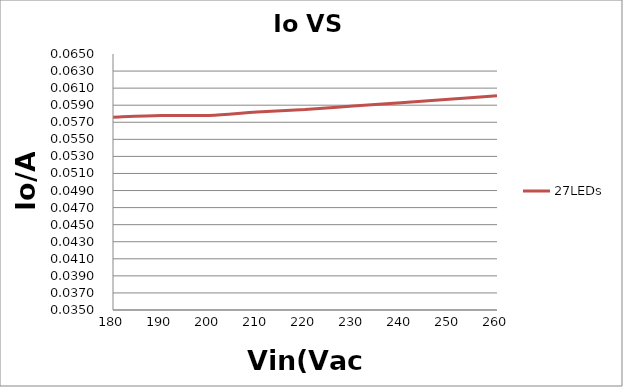
| Category | 27LEDs |
|---|---|
| 180.0 | 0.058 |
| 190.0 | 0.058 |
| 200.0 | 0.058 |
| 210.0 | 0.058 |
| 220.0 | 0.058 |
| 230.0 | 0.059 |
| 240.0 | 0.059 |
| 250.0 | 0.06 |
| 260.0 | 0.06 |